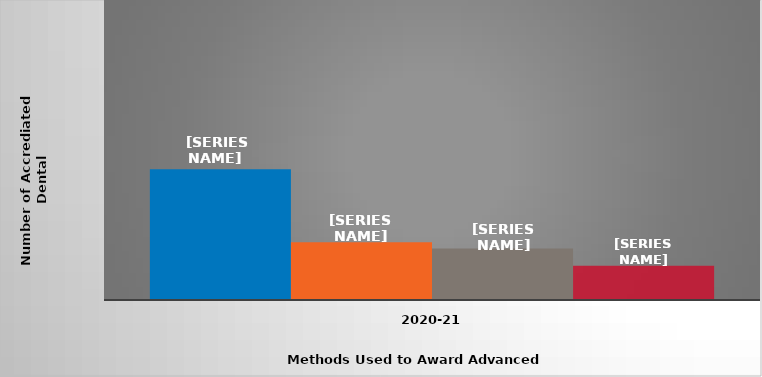
| Category | Transfer of credit | Equivalency examinations | Challenge examinations | Other |
|---|---|---|---|---|
| 2020-21 | 61 | 27 | 24 | 16 |